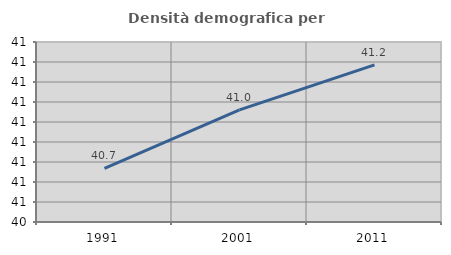
| Category | Densità demografica |
|---|---|
| 1991.0 | 40.669 |
| 2001.0 | 40.96 |
| 2011.0 | 41.186 |